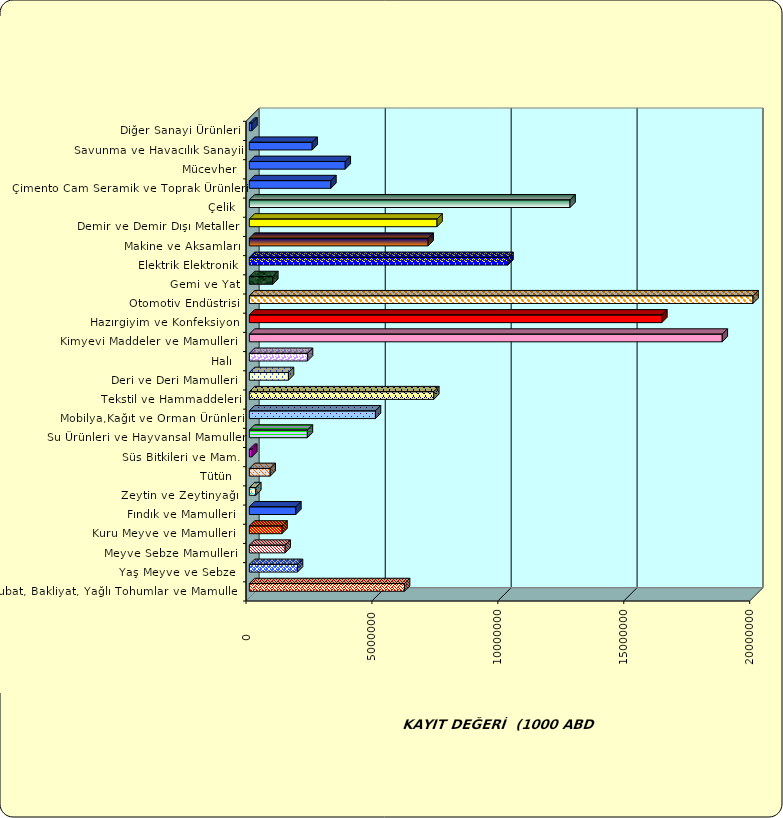
| Category | Series 0 |
|---|---|
|  Hububat, Bakliyat, Yağlı Tohumlar ve Mamulleri  | 6162101.52 |
|  Yaş Meyve ve Sebze   | 1911363.742 |
|  Meyve Sebze Mamulleri  | 1422081.432 |
|  Kuru Meyve ve Mamulleri   | 1295885.131 |
|  Fındık ve Mamulleri  | 1845128.891 |
|  Zeytin ve Zeytinyağı  | 255952.72 |
|  Tütün  | 828223.795 |
|  Süs Bitkileri ve Mam. | 96382.045 |
|  Su Ürünleri ve Hayvansal Mamuller | 2304445.48 |
|  Mobilya,Kağıt ve Orman Ürünleri | 5007810.643 |
|  Tekstil ve Hammaddeleri | 7323120.977 |
|  Deri ve Deri Mamulleri  | 1552907.1 |
|  Halı  | 2309266.559 |
|  Kimyevi Maddeler ve Mamulleri   | 18778623.558 |
|  Hazırgiyim ve Konfeksiyon  | 16379258.849 |
|  Otomotiv Endüstrisi | 28051340.851 |
|  Gemi ve Yat | 931175.305 |
|  Elektrik Elektronik | 10269708.678 |
|  Makine ve Aksamları | 7098748.58 |
|  Demir ve Demir Dışı Metaller  | 7452021.407 |
|  Çelik | 12734441.464 |
|  Çimento Cam Seramik ve Toprak Ürünleri | 3236801.123 |
|  Mücevher | 3808375.138 |
|  Savunma ve Havacılık Sanayii | 2496166.591 |
|  Diğer Sanayi Ürünleri | 100446.891 |